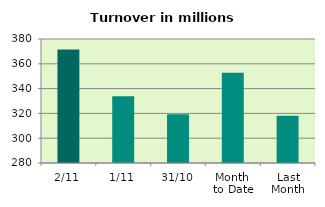
| Category | Series 0 |
|---|---|
| 2/11 | 371.617 |
| 1/11 | 333.873 |
| 31/10 | 319.349 |
| Month 
to Date | 352.745 |
| Last
Month | 318.176 |